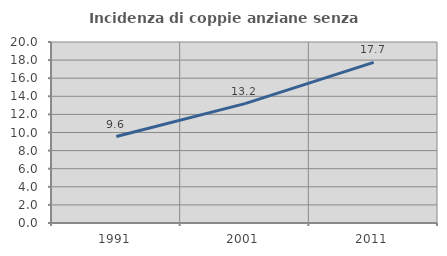
| Category | Incidenza di coppie anziane senza figli  |
|---|---|
| 1991.0 | 9.557 |
| 2001.0 | 13.195 |
| 2011.0 | 17.747 |